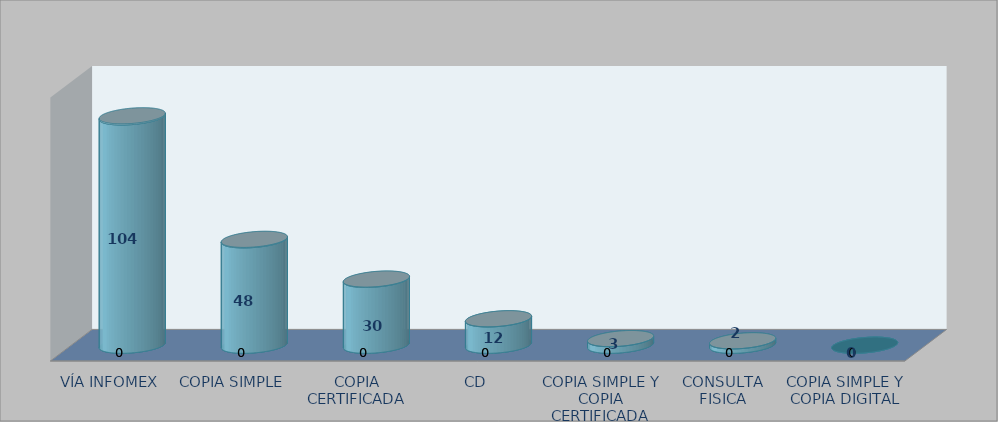
| Category | Series 0 | Series 1 | Series 2 | Series 3 |
|---|---|---|---|---|
| VÍA INFOMEX |  |  | 104 | 0.523 |
| COPIA SIMPLE |  |  | 48 | 0.241 |
| COPIA CERTIFICADA |  |  | 30 | 0.151 |
| CD |  |  | 12 | 0.06 |
| COPIA SIMPLE Y COPIA CERTIFICADA |  |  | 3 | 0.015 |
| CONSULTA FISICA |  |  | 2 | 0.01 |
| COPIA SIMPLE Y COPIA DIGITAL |  |  | 0 | 0 |